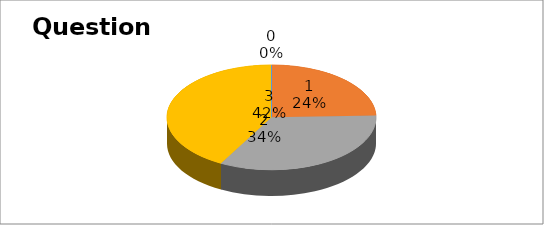
| Category | Series 0 |
|---|---|
| 0 | 0 |
| 1 | 32 |
| 2 | 44 |
| 3 | 55 |